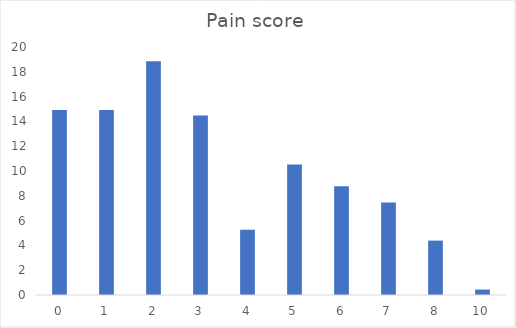
| Category | Pain score |
|---|---|
| 0 | 14.912 |
| 1 | 14.912 |
| 2 | 18.86 |
| 3 | 14.474 |
| 4 | 5.263 |
| 5 | 10.526 |
| 6 | 8.772 |
| 7 | 7.456 |
| 8 | 4.386 |
| 10 | 0.439 |